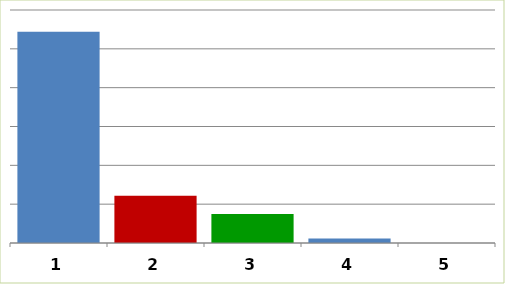
| Category | Series 0 |
|---|---|
| 0 | 271932057 |
| 1 | 60845192 |
| 2 | 37497115 |
| 3 | 5633191.98 |
| 4 | 0 |